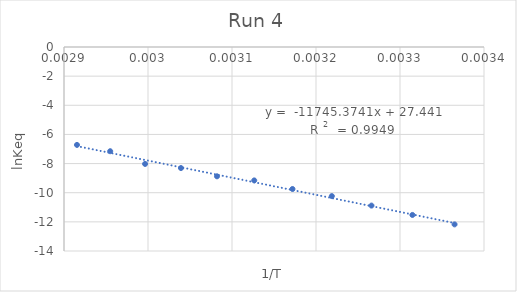
| Category | Series 0 |
|---|---|
| 0.003364963994885255 | -12.173 |
| 0.003314770617873243 | -11.526 |
| 0.0032660526487686982 | -10.884 |
| 0.0032188495831589788 | -10.233 |
| 0.003171985028230667 | -9.745 |
| 0.0031264655307175235 | -9.157 |
| 0.0030821390044691015 | -8.874 |
| 0.0030392365437802026 | -8.308 |
| 0.002996524032122737 | -8.025 |
| 0.002954995419757099 | -7.152 |
| 0.0029154518950437317 | -6.719 |